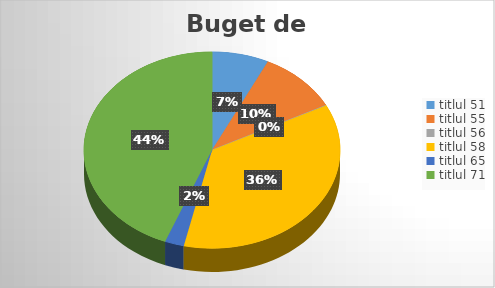
| Category | Series 0 |
|---|---|
| titlul 51 | 1372999 |
| titlul 55 | 1974766 |
| titlul 56 | 1050 |
| titlul 58 | 6913544 |
| titlul 65 | 461538 |
| titlul 71 | 8444348 |